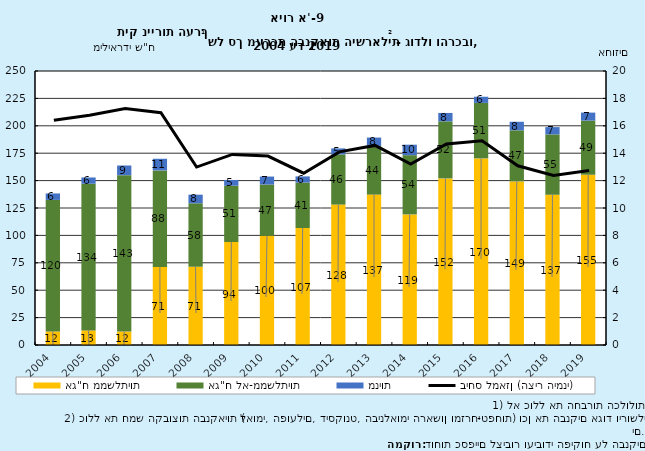
| Category | אג"ח ממשלתיות | אג"ח לא-ממשלתיות | מניות |
|---|---|---|---|
| 2004.0 | 12.353 | 120.023 | 5.897 |
| 2005.0 | 13.304 | 133.828 | 5.719 |
| 2006.0 | 12.275 | 142.651 | 8.852 |
| 2007.0 | 71.206 | 88.117 | 10.6 |
| 2008.0 | 71.4 | 57.895 | 7.853 |
| 2009.0 | 93.974 | 51.353 | 5.266 |
| 2010.0 | 99.652 | 46.739 | 7.299 |
| 2011.0 | 106.734 | 41.489 | 5.601 |
| 2012.0 | 128.124 | 45.796 | 5.459 |
| 2013.0 | 137.215 | 44.436 | 7.607 |
| 2014.0 | 119.166 | 54.039 | 9.544 |
| 2015.0 | 152.016 | 52.04 | 7.672 |
| 2016.0 | 170.263 | 50.627 | 5.635 |
| 2017.0 | 149.289 | 46.563 | 7.827 |
| 2018.0 | 137.084 | 55.056 | 6.661 |
| 2019.0 | 155.353 | 49.388 | 7.297 |